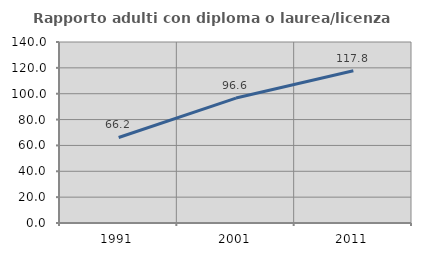
| Category | Rapporto adulti con diploma o laurea/licenza media  |
|---|---|
| 1991.0 | 66.154 |
| 2001.0 | 96.644 |
| 2011.0 | 117.77 |